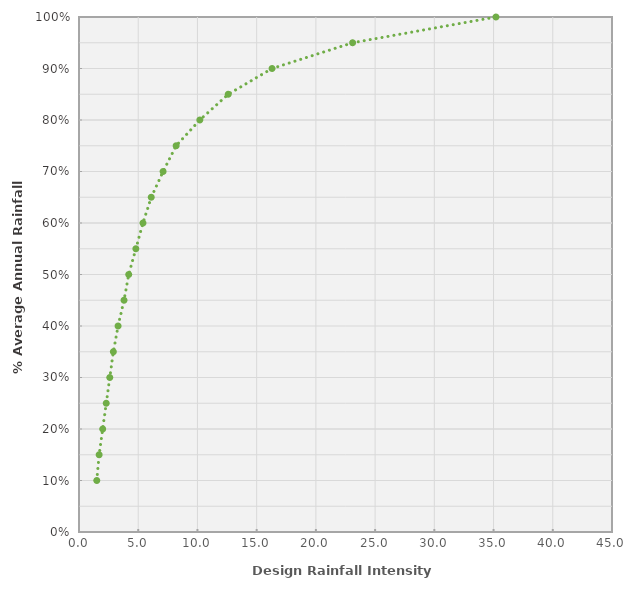
| Category | Cumulative Rainfall |
|---|---|
| 1.5 | 0.1 |
| 1.7 | 0.15 |
| 2.0 | 0.2 |
| 2.3 | 0.25 |
| 2.6 | 0.3 |
| 2.9 | 0.35 |
| 3.3 | 0.4 |
| 3.8 | 0.45 |
| 4.2 | 0.5 |
| 4.8 | 0.55 |
| 5.4 | 0.6 |
| 6.1 | 0.65 |
| 7.1 | 0.7 |
| 8.2 | 0.75 |
| 10.2 | 0.8 |
| 12.6 | 0.85 |
| 16.3 | 0.9 |
| 23.1 | 0.95 |
| 35.2 | 1 |